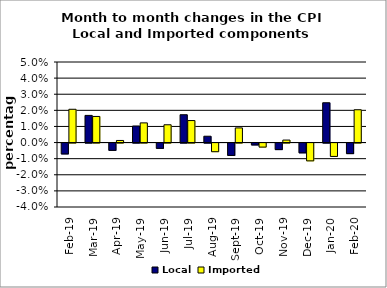
| Category | Local | Imported |
|---|---|---|
| 2019-02-01 | -0.007 | 0.021 |
| 2019-03-01 | 0.017 | 0.016 |
| 2019-04-01 | -0.005 | 0.001 |
| 2019-05-01 | 0.01 | 0.012 |
| 2019-06-01 | -0.003 | 0.011 |
| 2019-07-01 | 0.017 | 0.014 |
| 2019-08-01 | 0.004 | -0.005 |
| 2019-09-01 | -0.008 | 0.009 |
| 2019-10-01 | -0.001 | -0.003 |
| 2019-11-01 | -0.004 | 0.002 |
| 2019-12-01 | -0.006 | -0.011 |
| 2020-01-01 | 0.025 | -0.008 |
| 2020-02-01 | -0.007 | 0.02 |